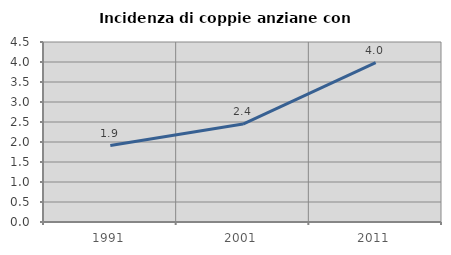
| Category | Incidenza di coppie anziane con figli |
|---|---|
| 1991.0 | 1.911 |
| 2001.0 | 2.448 |
| 2011.0 | 3.984 |